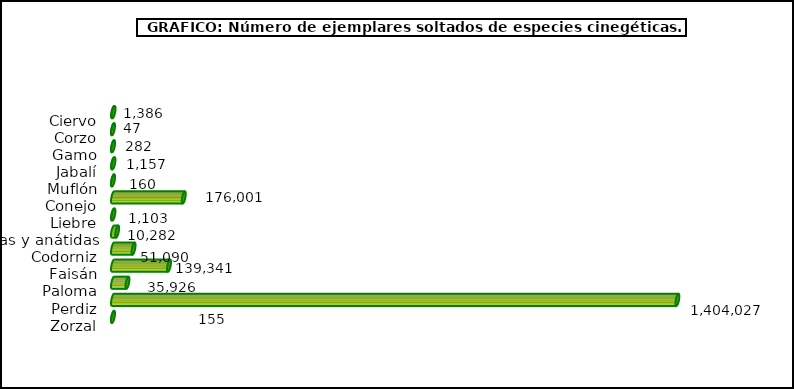
| Category | Series 1 |
|---|---|
| Ciervo | 1386 |
| Corzo | 47 |
| Gamo | 282 |
| Jabalí | 1157 |
| Muflón | 160 |
| Conejo | 176001 |
| Liebre | 1103 |
| Acuáticas y anátidas | 10282 |
| Codorniz | 51090 |
| Faisán | 139341 |
| Paloma | 35926 |
| Perdiz | 1404027 |
| Zorzal | 155 |